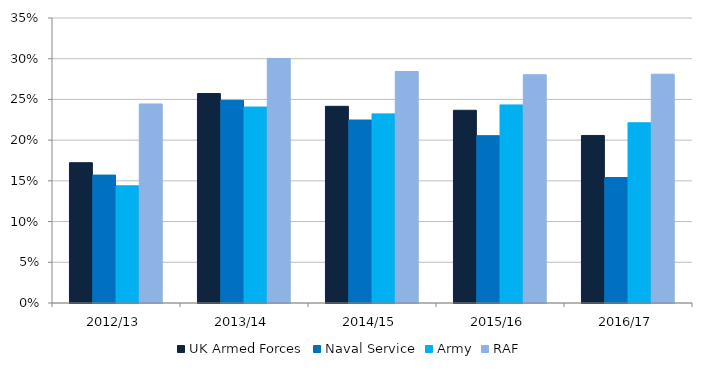
| Category | UK Armed Forces | Naval Service | Army | RAF |
|---|---|---|---|---|
| 2012/13 | 0.172 | 0.157 | 0.144 | 0.244 |
| 2013/14 | 0.257 | 0.249 | 0.241 | 0.3 |
| 2014/15 | 0.242 | 0.225 | 0.232 | 0.284 |
| 2015/16 | 0.237 | 0.205 | 0.243 | 0.28 |
| 2016/17 | 0.206 | 0.154 | 0.221 | 0.281 |